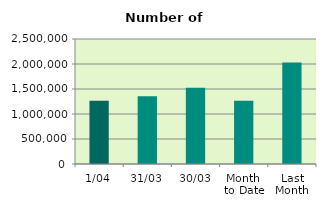
| Category | Series 0 |
|---|---|
| 1/04 | 1262726 |
| 31/03 | 1354352 |
| 30/03 | 1526960 |
| Month 
to Date | 1262726 |
| Last
Month | 2030137.913 |